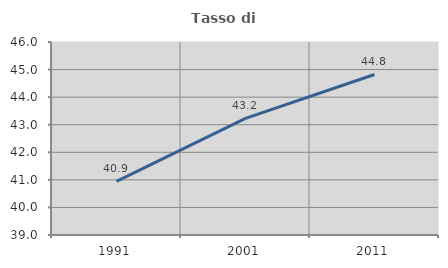
| Category | Tasso di occupazione   |
|---|---|
| 1991.0 | 40.948 |
| 2001.0 | 43.231 |
| 2011.0 | 44.821 |